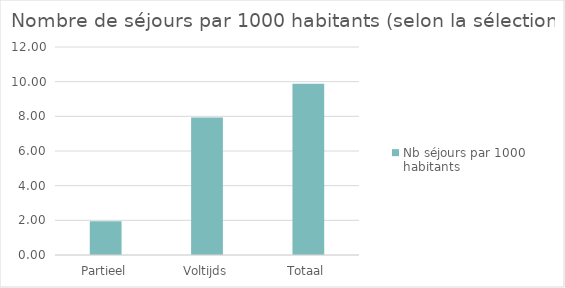
| Category | Totaal |
|---|---|
| Partieel | 1.954 |
| Voltijds | 7.932 |
| Totaal | 9.885 |